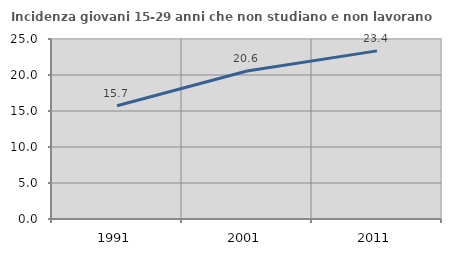
| Category | Incidenza giovani 15-29 anni che non studiano e non lavorano  |
|---|---|
| 1991.0 | 15.736 |
| 2001.0 | 20.56 |
| 2011.0 | 23.351 |